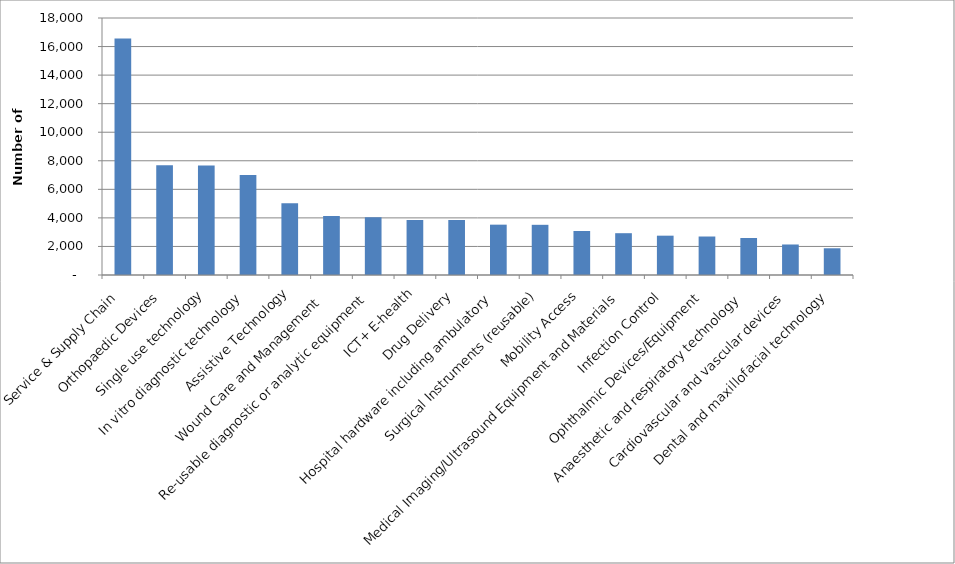
| Category | Series 0 |
|---|---|
| Service & Supply Chain | 16564.9 |
| Orthopaedic Devices | 7682.16 |
| Single use technology | 7665.34 |
| In vitro diagnostic technology | 6996.15 |
| Assistive Technology | 5020.4 |
| Wound Care and Management  | 4138.5 |
| Re-usable diagnostic or analytic equipment | 4041.95 |
| ICT+ E-health | 3855.73 |
| Drug Delivery | 3845.5 |
| Hospital hardware including ambulatory | 3525.9 |
| Surgical Instruments (reusable) | 3515 |
| Mobility Access | 3082.19 |
| Medical Imaging/Ultrasound Equipment and Materials | 2927.95 |
| Infection Control  | 2754.2 |
| Ophthalmic Devices/Equipment | 2696 |
| Anaesthetic and respiratory technology | 2591 |
| Cardiovascular and vascular devices | 2137.05 |
| Dental and maxillofacial technology | 1871.8 |